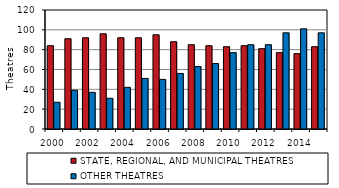
| Category | STATE, REGIONAL, AND MUNICIPAL THEATRES | OTHER THEATRES |
|---|---|---|
| 2000.0 | 84 | 27 |
| 2001.0 | 91 | 39 |
| 2002.0 | 92 | 37 |
| 2003.0 | 96 | 31 |
| 2004.0 | 92 | 42 |
| 2005.0 | 92 | 51 |
| 2006.0 | 95 | 50 |
| 2007.0 | 88 | 56 |
| 2008.0 | 85 | 63 |
| 2009.0 | 84 | 66 |
| 2010.0 | 83 | 77 |
| 2011.0 | 84 | 85 |
| 2012.0 | 81 | 85 |
| 2013.0 | 77 | 97 |
| 2014.0 | 76 | 101 |
| 2015.0 | 83 | 97 |